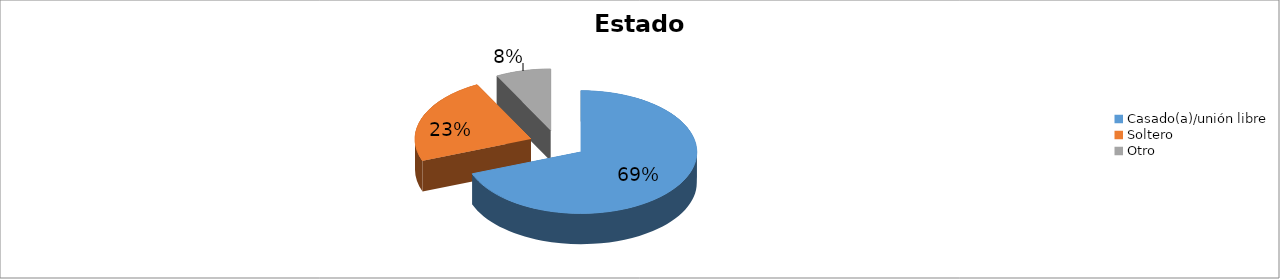
| Category | Series 0 |
|---|---|
| Casado(a)/unión libre | 0.692 |
| Soltero | 0.231 |
| Otro | 0.077 |